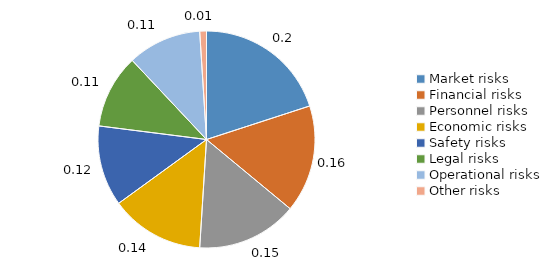
| Category | Series 0 |
|---|---|
| Market risks | 0.2 |
| Financial risks | 0.16 |
| Personnel risks | 0.15 |
| Economic risks | 0.14 |
| Safety risks | 0.12 |
| Legal risks | 0.11 |
| Operational risks | 0.11 |
| Other risks | 0.01 |